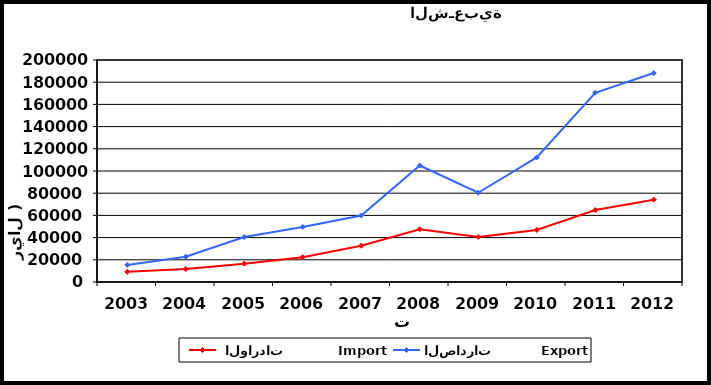
| Category |  الواردات           Import | الصادرات          Export |
|---|---|---|
| 2003.0 | 9211 | 15367 |
| 2004.0 | 11681 | 22787 |
| 2005.0 | 16521 | 40519 |
| 2006.0 | 22391 | 49556 |
| 2007.0 | 32664 | 59840 |
| 2008.0 | 47541 | 104954 |
| 2009.0 | 40601 | 80417 |
| 2010.0 | 46851 | 112210 |
| 2011.0 | 64829 | 170500 |
| 2012.0 | 74195 | 188229 |